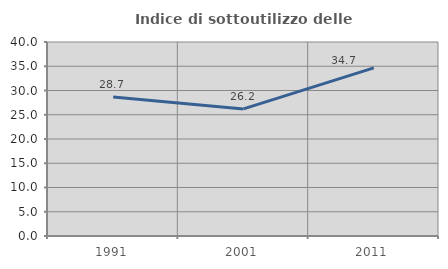
| Category | Indice di sottoutilizzo delle abitazioni  |
|---|---|
| 1991.0 | 28.676 |
| 2001.0 | 26.199 |
| 2011.0 | 34.66 |